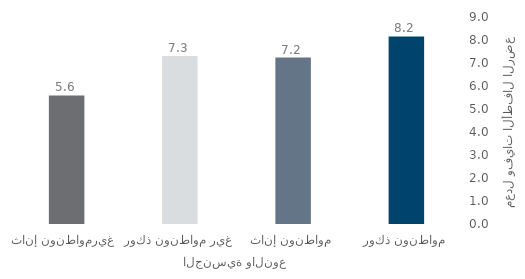
| Category | Series 0 |
|---|---|
| مواطنون ذكور | 8.158 |
| مواطنون إناث | 7.238 |
| غير مواطنون ذكور | 7.302 |
| غيرمواطنون إناث  | 5.59 |